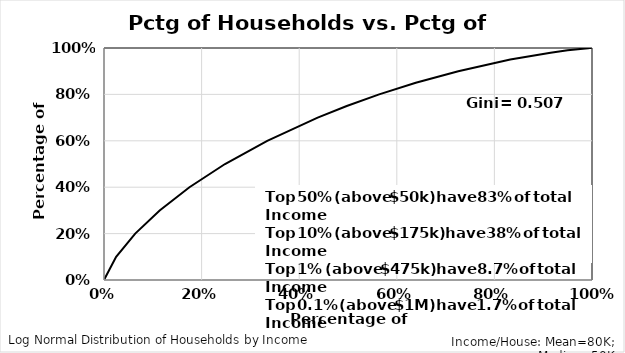
| Category | %$-CDF |
|---|---|
| 0.0 | 0 |
| 0.02485588890855334 | 0.1 |
| 0.06394124853096611 | 0.2 |
| 0.11404671386315277 | 0.3 |
| 0.17509230831554207 | 0.4 |
| 0.2479723984434194 | 0.5 |
| 0.33449410313164324 | 0.6 |
| 0.4378259072606145 | 0.7 |
| 0.49744902024349713 | 0.75 |
| 0.563849758953999 | 0.8 |
| 0.6389109175518921 | 0.85 |
| 0.7259692364039199 | 0.9 |
| 0.8324693850578315 | 0.95 |
| 0.9151028029766425 | 0.98 |
| 0.9500628910074391 | 0.99 |
| 0.9709501657588282 | 0.995 |
| 0.9920094776533598 | 0.999 |
| 0.9954681566669915 | 1 |
| 0.9988097530381429 | 1 |
| 0.9998308182628777 | 1 |